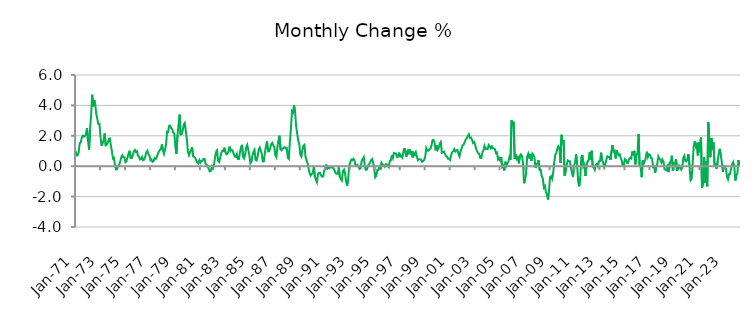
| Category | Series 0 |
|---|---|
| 1971-01-01 | 1.014 |
| 1971-02-01 | 0.711 |
| 1971-03-01 | 0.712 |
| 1971-04-01 | 0.919 |
| 1971-05-01 | 1.51 |
| 1971-06-01 | 1.551 |
| 1971-07-01 | 1.878 |
| 1971-08-01 | 2.005 |
| 1971-09-01 | 1.95 |
| 1971-10-01 | 1.987 |
| 1971-11-01 | 2.104 |
| 1971-12-01 | 2.509 |
| 1972-01-01 | 1.699 |
| 1972-02-01 | 1.094 |
| 1972-03-01 | 2.462 |
| 1972-04-01 | 3.36 |
| 1972-05-01 | 4.697 |
| 1972-06-01 | 3.937 |
| 1972-07-01 | 4.355 |
| 1972-08-01 | 4.026 |
| 1972-09-01 | 3.417 |
| 1972-10-01 | 3.088 |
| 1972-11-01 | 2.774 |
| 1972-12-01 | 2.784 |
| 1973-01-01 | 1.938 |
| 1973-02-01 | 1.343 |
| 1973-03-01 | 1.524 |
| 1973-04-01 | 1.712 |
| 1973-05-01 | 2.158 |
| 1973-06-01 | 1.373 |
| 1973-07-01 | 1.418 |
| 1973-08-01 | 1.551 |
| 1973-09-01 | 1.782 |
| 1973-10-01 | 1.816 |
| 1973-11-01 | 1.359 |
| 1973-12-01 | 0.961 |
| 1974-01-01 | 0.511 |
| 1974-02-01 | 0.548 |
| 1974-03-01 | -0.022 |
| 1974-04-01 | -0.216 |
| 1974-05-01 | -0.191 |
| 1974-06-01 | 0.007 |
| 1974-07-01 | 0.097 |
| 1974-08-01 | 0.326 |
| 1974-09-01 | 0.591 |
| 1974-10-01 | 0.722 |
| 1974-11-01 | 0.594 |
| 1974-12-01 | 0.583 |
| 1975-01-01 | 0.268 |
| 1975-02-01 | 0.337 |
| 1975-03-01 | 0.597 |
| 1975-04-01 | 0.845 |
| 1975-05-01 | 1.017 |
| 1975-06-01 | 0.539 |
| 1975-07-01 | 0.526 |
| 1975-08-01 | 0.722 |
| 1975-09-01 | 0.97 |
| 1975-10-01 | 1.067 |
| 1975-11-01 | 0.93 |
| 1975-12-01 | 0.985 |
| 1976-01-01 | 0.687 |
| 1976-02-01 | 0.643 |
| 1976-03-01 | 0.437 |
| 1976-04-01 | 0.463 |
| 1976-05-01 | 0.603 |
| 1976-06-01 | 0.392 |
| 1976-07-01 | 0.432 |
| 1976-08-01 | 0.636 |
| 1976-09-01 | 0.905 |
| 1976-10-01 | 1.011 |
| 1976-11-01 | 0.8 |
| 1976-12-01 | 0.709 |
| 1977-01-01 | 0.392 |
| 1977-02-01 | 0.448 |
| 1977-03-01 | 0.289 |
| 1977-04-01 | 0.338 |
| 1977-05-01 | 0.521 |
| 1977-06-01 | 0.47 |
| 1977-07-01 | 0.575 |
| 1977-08-01 | 0.784 |
| 1977-09-01 | 0.951 |
| 1977-10-01 | 1.061 |
| 1977-11-01 | 1.111 |
| 1977-12-01 | 1.434 |
| 1978-01-01 | 1.05 |
| 1978-02-01 | 0.811 |
| 1978-03-01 | 1.084 |
| 1978-04-01 | 1.443 |
| 1978-05-01 | 2.28 |
| 1978-06-01 | 2.255 |
| 1978-07-01 | 2.668 |
| 1978-08-01 | 2.665 |
| 1978-09-01 | 2.498 |
| 1978-10-01 | 2.424 |
| 1978-11-01 | 2.207 |
| 1978-12-01 | 2.133 |
| 1979-01-01 | 1.242 |
| 1979-02-01 | 0.823 |
| 1979-03-01 | 2.034 |
| 1979-04-01 | 2.732 |
| 1979-05-01 | 3.394 |
| 1979-06-01 | 2.083 |
| 1979-07-01 | 2.118 |
| 1979-08-01 | 2.335 |
| 1979-09-01 | 2.734 |
| 1979-10-01 | 2.841 |
| 1979-11-01 | 2.3 |
| 1979-12-01 | 1.747 |
| 1980-01-01 | 0.943 |
| 1980-02-01 | 0.726 |
| 1980-03-01 | 0.925 |
| 1980-04-01 | 1.073 |
| 1980-05-01 | 1.242 |
| 1980-06-01 | 0.656 |
| 1980-07-01 | 0.591 |
| 1980-08-01 | 0.543 |
| 1980-09-01 | 0.381 |
| 1980-10-01 | 0.243 |
| 1980-11-01 | 0.186 |
| 1980-12-01 | 0.395 |
| 1981-01-01 | 0.234 |
| 1981-02-01 | 0.354 |
| 1981-03-01 | 0.354 |
| 1981-04-01 | 0.474 |
| 1981-05-01 | 0.478 |
| 1981-06-01 | 0.161 |
| 1981-07-01 | 0.077 |
| 1981-08-01 | 0.019 |
| 1981-09-01 | -0.188 |
| 1981-10-01 | -0.344 |
| 1981-11-01 | -0.317 |
| 1981-12-01 | -0.035 |
| 1982-01-01 | -0.155 |
| 1982-02-01 | 0.068 |
| 1982-03-01 | 0.555 |
| 1982-04-01 | 0.929 |
| 1982-05-01 | 1.031 |
| 1982-06-01 | 0.372 |
| 1982-07-01 | 0.28 |
| 1982-08-01 | 0.532 |
| 1982-09-01 | 0.859 |
| 1982-10-01 | 1.012 |
| 1982-11-01 | 0.998 |
| 1982-12-01 | 1.225 |
| 1983-01-01 | 0.92 |
| 1983-02-01 | 0.783 |
| 1983-03-01 | 0.81 |
| 1983-04-01 | 0.995 |
| 1983-05-01 | 1.293 |
| 1983-06-01 | 1.001 |
| 1983-07-01 | 1.08 |
| 1983-08-01 | 1.015 |
| 1983-09-01 | 0.803 |
| 1983-10-01 | 0.652 |
| 1983-11-01 | 0.611 |
| 1983-12-01 | 0.798 |
| 1984-01-01 | 0.473 |
| 1984-02-01 | 0.478 |
| 1984-03-01 | 0.903 |
| 1984-04-01 | 1.241 |
| 1984-05-01 | 1.404 |
| 1984-06-01 | 0.614 |
| 1984-07-01 | 0.511 |
| 1984-08-01 | 0.774 |
| 1984-09-01 | 1.225 |
| 1984-10-01 | 1.401 |
| 1984-11-01 | 1.068 |
| 1984-12-01 | 0.734 |
| 1985-01-01 | 0.202 |
| 1985-02-01 | 0.279 |
| 1985-03-01 | 0.684 |
| 1985-04-01 | 0.954 |
| 1985-05-01 | 1.079 |
| 1985-06-01 | 0.413 |
| 1985-07-01 | 0.38 |
| 1985-08-01 | 0.656 |
| 1985-09-01 | 1.087 |
| 1985-10-01 | 1.228 |
| 1985-11-01 | 1.02 |
| 1985-12-01 | 0.807 |
| 1986-01-01 | 0.311 |
| 1986-02-01 | 0.317 |
| 1986-03-01 | 0.923 |
| 1986-04-01 | 1.322 |
| 1986-05-01 | 1.629 |
| 1986-06-01 | 0.97 |
| 1986-07-01 | 0.982 |
| 1986-08-01 | 1.161 |
| 1986-09-01 | 1.443 |
| 1986-10-01 | 1.536 |
| 1986-11-01 | 1.373 |
| 1986-12-01 | 1.263 |
| 1987-01-01 | 0.724 |
| 1987-02-01 | 0.595 |
| 1987-03-01 | 1.283 |
| 1987-04-01 | 1.705 |
| 1987-05-01 | 2.003 |
| 1987-06-01 | 1.108 |
| 1987-07-01 | 1.049 |
| 1987-08-01 | 1.142 |
| 1987-09-01 | 1.226 |
| 1987-10-01 | 1.253 |
| 1987-11-01 | 1.16 |
| 1987-12-01 | 1.188 |
| 1988-01-01 | 0.558 |
| 1988-02-01 | 0.478 |
| 1988-03-01 | 1.666 |
| 1988-04-01 | 2.466 |
| 1988-05-01 | 3.62 |
| 1988-06-01 | 3.526 |
| 1988-07-01 | 4.01 |
| 1988-08-01 | 3.546 |
| 1988-09-01 | 2.637 |
| 1988-10-01 | 2.133 |
| 1988-11-01 | 1.68 |
| 1988-12-01 | 1.467 |
| 1989-01-01 | 0.756 |
| 1989-02-01 | 0.634 |
| 1989-03-01 | 1.069 |
| 1989-04-01 | 1.347 |
| 1989-05-01 | 1.408 |
| 1989-06-01 | 0.607 |
| 1989-07-01 | 0.411 |
| 1989-08-01 | 0.192 |
| 1989-09-01 | -0.165 |
| 1989-10-01 | -0.462 |
| 1989-11-01 | -0.618 |
| 1989-12-01 | -0.507 |
| 1990-01-01 | -0.459 |
| 1990-02-01 | -0.019 |
| 1990-03-01 | -0.686 |
| 1990-04-01 | -0.897 |
| 1990-05-01 | -1.058 |
| 1990-06-01 | -0.51 |
| 1990-07-01 | -0.437 |
| 1990-08-01 | -0.428 |
| 1990-09-01 | -0.604 |
| 1990-10-01 | -0.695 |
| 1990-11-01 | -0.649 |
| 1990-12-01 | -0.278 |
| 1991-01-01 | -0.196 |
| 1991-02-01 | 0.105 |
| 1991-03-01 | -0.159 |
| 1991-04-01 | -0.105 |
| 1991-05-01 | -0.139 |
| 1991-06-01 | -0.062 |
| 1991-07-01 | -0.066 |
| 1991-08-01 | -0.093 |
| 1991-09-01 | -0.159 |
| 1991-10-01 | -0.285 |
| 1991-11-01 | -0.467 |
| 1991-12-01 | -0.497 |
| 1992-01-01 | -0.494 |
| 1992-02-01 | -0.076 |
| 1992-03-01 | -0.697 |
| 1992-04-01 | -0.848 |
| 1992-05-01 | -0.944 |
| 1992-06-01 | -0.312 |
| 1992-07-01 | -0.225 |
| 1992-08-01 | -0.473 |
| 1992-09-01 | -1.015 |
| 1992-10-01 | -1.272 |
| 1992-11-01 | -0.873 |
| 1992-12-01 | 0.026 |
| 1993-01-01 | 0.247 |
| 1993-02-01 | 0.437 |
| 1993-03-01 | 0.391 |
| 1993-04-01 | 0.487 |
| 1993-05-01 | 0.413 |
| 1993-06-01 | 0.047 |
| 1993-07-01 | 0.03 |
| 1993-08-01 | 0.082 |
| 1993-09-01 | -0.063 |
| 1993-10-01 | -0.18 |
| 1993-11-01 | -0.118 |
| 1993-12-01 | 0.35 |
| 1994-01-01 | 0.48 |
| 1994-02-01 | 0.595 |
| 1994-03-01 | -0.023 |
| 1994-04-01 | -0.241 |
| 1994-05-01 | -0.212 |
| 1994-06-01 | 0.019 |
| 1994-07-01 | 0.12 |
| 1994-08-01 | 0.247 |
| 1994-09-01 | 0.391 |
| 1994-10-01 | 0.472 |
| 1994-11-01 | 0.222 |
| 1994-12-01 | -0.131 |
| 1995-01-01 | -0.733 |
| 1995-02-01 | -0.635 |
| 1995-03-01 | -0.24 |
| 1995-04-01 | -0.251 |
| 1995-05-01 | 0.043 |
| 1995-06-01 | -0.212 |
| 1995-07-01 | 0.218 |
| 1995-08-01 | 0.097 |
| 1995-09-01 | 0.057 |
| 1995-10-01 | -0.036 |
| 1995-11-01 | 0.126 |
| 1995-12-01 | 0.123 |
| 1996-01-01 | 0.036 |
| 1996-02-01 | -0.061 |
| 1996-03-01 | 0.33 |
| 1996-04-01 | 0.389 |
| 1996-05-01 | 0.736 |
| 1996-06-01 | 0.535 |
| 1996-07-01 | 0.868 |
| 1996-08-01 | 0.833 |
| 1996-09-01 | 0.834 |
| 1996-10-01 | 0.603 |
| 1996-11-01 | 0.635 |
| 1996-12-01 | 0.892 |
| 1997-01-01 | 0.634 |
| 1997-02-01 | 0.672 |
| 1997-03-01 | 0.57 |
| 1997-04-01 | 0.919 |
| 1997-05-01 | 1.19 |
| 1997-06-01 | 0.893 |
| 1997-07-01 | 0.625 |
| 1997-08-01 | 0.99 |
| 1997-09-01 | 0.877 |
| 1997-10-01 | 1.126 |
| 1997-11-01 | 0.779 |
| 1997-12-01 | 0.981 |
| 1998-01-01 | 0.576 |
| 1998-02-01 | 0.861 |
| 1998-03-01 | 0.744 |
| 1998-04-01 | 0.917 |
| 1998-05-01 | 0.646 |
| 1998-06-01 | 0.394 |
| 1998-07-01 | 0.47 |
| 1998-08-01 | 0.438 |
| 1998-09-01 | 0.441 |
| 1998-10-01 | 0.291 |
| 1998-11-01 | 0.339 |
| 1998-12-01 | 0.406 |
| 1999-01-01 | 0.599 |
| 1999-02-01 | 1.189 |
| 1999-03-01 | 1.036 |
| 1999-04-01 | 1.017 |
| 1999-05-01 | 1.102 |
| 1999-06-01 | 1.154 |
| 1999-07-01 | 1.343 |
| 1999-08-01 | 1.715 |
| 1999-09-01 | 1.719 |
| 1999-10-01 | 1.552 |
| 1999-11-01 | 1.038 |
| 1999-12-01 | 1.38 |
| 2000-01-01 | 1.085 |
| 2000-02-01 | 1.214 |
| 2000-03-01 | 1.492 |
| 2000-04-01 | 1.598 |
| 2000-05-01 | 0.89 |
| 2000-06-01 | 0.921 |
| 2000-07-01 | 0.966 |
| 2000-08-01 | 0.796 |
| 2000-09-01 | 0.675 |
| 2000-10-01 | 0.638 |
| 2000-11-01 | 0.487 |
| 2000-12-01 | 0.497 |
| 2001-01-01 | 0.412 |
| 2001-02-01 | 0.769 |
| 2001-03-01 | 0.912 |
| 2001-04-01 | 0.993 |
| 2001-05-01 | 1.124 |
| 2001-06-01 | 0.967 |
| 2001-07-01 | 1.046 |
| 2001-08-01 | 1.074 |
| 2001-09-01 | 0.81 |
| 2001-10-01 | 0.64 |
| 2001-11-01 | 0.977 |
| 2001-12-01 | 1.162 |
| 2002-01-01 | 1.393 |
| 2002-02-01 | 1.426 |
| 2002-03-01 | 1.606 |
| 2002-04-01 | 1.755 |
| 2002-05-01 | 1.852 |
| 2002-06-01 | 1.986 |
| 2002-07-01 | 2.098 |
| 2002-08-01 | 1.873 |
| 2002-09-01 | 1.884 |
| 2002-10-01 | 1.739 |
| 2002-11-01 | 1.527 |
| 2002-12-01 | 1.595 |
| 2003-01-01 | 1.421 |
| 2003-02-01 | 1.131 |
| 2003-03-01 | 0.968 |
| 2003-04-01 | 0.845 |
| 2003-05-01 | 0.804 |
| 2003-06-01 | 0.543 |
| 2003-07-01 | 0.544 |
| 2003-08-01 | 0.903 |
| 2003-09-01 | 1.045 |
| 2003-10-01 | 1.331 |
| 2003-11-01 | 1.129 |
| 2003-12-01 | 1.158 |
| 2004-01-01 | 1.129 |
| 2004-02-01 | 1.4 |
| 2004-03-01 | 1.322 |
| 2004-04-01 | 1.181 |
| 2004-05-01 | 1.302 |
| 2004-06-01 | 1.177 |
| 2004-07-01 | 1.173 |
| 2004-08-01 | 1.116 |
| 2004-09-01 | 0.859 |
| 2004-10-01 | 0.903 |
| 2004-11-01 | 0.446 |
| 2004-12-01 | 0.537 |
| 2005-01-01 | 0.389 |
| 2005-02-01 | 0.608 |
| 2005-03-01 | -0.051 |
| 2005-04-01 | 0.02 |
| 2005-05-01 | -0.284 |
| 2005-06-01 | 0.293 |
| 2005-07-01 | 0.028 |
| 2005-08-01 | 0.174 |
| 2005-09-01 | 0.31 |
| 2005-10-01 | 0.6 |
| 2005-11-01 | 0.429 |
| 2005-12-01 | 3.014 |
| 2006-01-01 | 2.685 |
| 2006-02-01 | 2.921 |
| 2006-03-01 | 0.474 |
| 2006-04-01 | 0.778 |
| 2006-05-01 | 0.48 |
| 2006-06-01 | 0.585 |
| 2006-07-01 | 0.184 |
| 2006-08-01 | 0.682 |
| 2006-09-01 | 0.777 |
| 2006-10-01 | 0.666 |
| 2006-11-01 | 0.183 |
| 2006-12-01 | -1.12 |
| 2007-01-01 | -0.865 |
| 2007-02-01 | -0.455 |
| 2007-03-01 | 0.64 |
| 2007-04-01 | 0.822 |
| 2007-05-01 | 0.511 |
| 2007-06-01 | 0.806 |
| 2007-07-01 | 0.354 |
| 2007-08-01 | 0.823 |
| 2007-09-01 | 0.74 |
| 2007-10-01 | 0.585 |
| 2007-11-01 | -0.117 |
| 2007-12-01 | 0.11 |
| 2008-01-01 | 0.185 |
| 2008-02-01 | 0.395 |
| 2008-03-01 | -0.258 |
| 2008-04-01 | -0.252 |
| 2008-05-01 | -0.673 |
| 2008-06-01 | -0.785 |
| 2008-07-01 | -1.399 |
| 2008-08-01 | -1.297 |
| 2008-09-01 | -1.695 |
| 2008-10-01 | -1.889 |
| 2008-11-01 | -2.193 |
| 2008-12-01 | -1.569 |
| 2009-01-01 | -0.715 |
| 2009-02-01 | -0.655 |
| 2009-03-01 | -0.832 |
| 2009-04-01 | -0.431 |
| 2009-05-01 | 0.255 |
| 2009-06-01 | 0.758 |
| 2009-07-01 | 0.853 |
| 2009-08-01 | 1.154 |
| 2009-09-01 | 1.31 |
| 2009-10-01 | 1.192 |
| 2009-11-01 | 0.21 |
| 2009-12-01 | 2.065 |
| 2010-01-01 | 1.513 |
| 2010-02-01 | 1.706 |
| 2010-03-01 | -0.629 |
| 2010-04-01 | -0.336 |
| 2010-05-01 | 0.088 |
| 2010-06-01 | 0.377 |
| 2010-07-01 | 0.335 |
| 2010-08-01 | 0.331 |
| 2010-09-01 | -0.082 |
| 2010-10-01 | -0.397 |
| 2010-11-01 | -0.716 |
| 2010-12-01 | 0.063 |
| 2011-01-01 | 0.22 |
| 2011-02-01 | 0.778 |
| 2011-03-01 | 0.121 |
| 2011-04-01 | -1.012 |
| 2011-05-01 | -1.326 |
| 2011-06-01 | -0.771 |
| 2011-07-01 | 0.572 |
| 2011-08-01 | 0.742 |
| 2011-09-01 | -0.009 |
| 2011-10-01 | 0.122 |
| 2011-11-01 | -0.644 |
| 2011-12-01 | 0.033 |
| 2012-01-01 | 0.301 |
| 2012-02-01 | 0.375 |
| 2012-03-01 | 0.909 |
| 2012-04-01 | 0.411 |
| 2012-05-01 | 1.018 |
| 2012-06-01 | -0.034 |
| 2012-07-01 | -0.071 |
| 2012-08-01 | -0.232 |
| 2012-09-01 | 0.088 |
| 2012-10-01 | 0.148 |
| 2012-11-01 | -0.013 |
| 2012-12-01 | 0.323 |
| 2013-01-01 | 0.342 |
| 2013-02-01 | 0.887 |
| 2013-03-01 | 0.401 |
| 2013-04-01 | 0.253 |
| 2013-05-01 | -0.07 |
| 2013-06-01 | 0.125 |
| 2013-07-01 | 0.425 |
| 2013-08-01 | 0.649 |
| 2013-09-01 | 0.612 |
| 2013-10-01 | 0.611 |
| 2013-11-01 | 0.411 |
| 2013-12-01 | 0.973 |
| 2014-01-01 | 1.387 |
| 2014-02-01 | 0.96 |
| 2014-03-01 | 1.009 |
| 2014-04-01 | 0.509 |
| 2014-05-01 | 1.049 |
| 2014-06-01 | 0.832 |
| 2014-07-01 | 0.722 |
| 2014-08-01 | 0.774 |
| 2014-09-01 | 0.517 |
| 2014-10-01 | 0.349 |
| 2014-11-01 | -0.043 |
| 2014-12-01 | 0.166 |
| 2015-01-01 | 0.474 |
| 2015-02-01 | 0.409 |
| 2015-03-01 | 0.22 |
| 2015-04-01 | 0.227 |
| 2015-05-01 | 0.48 |
| 2015-06-01 | 0.546 |
| 2015-07-01 | 0.503 |
| 2015-08-01 | 0.962 |
| 2015-09-01 | 0.722 |
| 2015-10-01 | 1.009 |
| 2015-11-01 | 0.122 |
| 2015-12-01 | 0.777 |
| 2016-01-01 | 0.8 |
| 2016-02-01 | 2.119 |
| 2016-03-01 | 0.079 |
| 2016-04-01 | -0.073 |
| 2016-05-01 | -0.725 |
| 2016-06-01 | 0.377 |
| 2016-07-01 | 0.18 |
| 2016-08-01 | 0.326 |
| 2016-09-01 | 0.568 |
| 2016-10-01 | 0.952 |
| 2016-11-01 | 0.607 |
| 2016-12-01 | 0.782 |
| 2017-01-01 | 0.741 |
| 2017-02-01 | 0.545 |
| 2017-03-01 | 0.511 |
| 2017-04-01 | -0.073 |
| 2017-05-01 | -0.051 |
| 2017-06-01 | -0.425 |
| 2017-07-01 | -0.025 |
| 2017-08-01 | 0.142 |
| 2017-09-01 | 0.642 |
| 2017-10-01 | 0.491 |
| 2017-11-01 | 0.429 |
| 2017-12-01 | 0.248 |
| 2018-01-01 | 0.435 |
| 2018-02-01 | 0.294 |
| 2018-03-01 | -0.206 |
| 2018-04-01 | -0.223 |
| 2018-05-01 | -0.269 |
| 2018-06-01 | 0.109 |
| 2018-07-01 | -0.387 |
| 2018-08-01 | 0.249 |
| 2018-09-01 | 0.274 |
| 2018-10-01 | 0.688 |
| 2018-11-01 | -0.297 |
| 2018-12-01 | 0.192 |
| 2019-01-01 | 0.153 |
| 2019-02-01 | 0.466 |
| 2019-03-01 | -0.248 |
| 2019-04-01 | -0.226 |
| 2019-05-01 | 0.03 |
| 2019-06-01 | -0.078 |
| 2019-07-01 | -0.218 |
| 2019-08-01 | -0.086 |
| 2019-09-01 | 0.545 |
| 2019-10-01 | 0.682 |
| 2019-11-01 | 0.347 |
| 2019-12-01 | 0.32 |
| 2020-01-01 | 0.474 |
| 2020-02-01 | 0.786 |
| 2020-03-01 | 0.013 |
| 2020-04-01 | -0.927 |
| 2020-05-01 | -0.83 |
| 2020-06-01 | 0.174 |
| 2020-07-01 | 1.337 |
| 2020-08-01 | 1.64 |
| 2020-09-01 | 1.328 |
| 2020-10-01 | 1.541 |
| 2020-11-01 | 0.713 |
| 2020-12-01 | 1.587 |
| 2021-01-01 | 0.914 |
| 2021-02-01 | 1.883 |
| 2021-03-01 | -1.407 |
| 2021-04-01 | -1.184 |
| 2021-05-01 | 0.594 |
| 2021-06-01 | -1.104 |
| 2021-07-01 | 0.328 |
| 2021-08-01 | -1.328 |
| 2021-09-01 | 2.887 |
| 2021-10-01 | 1.799 |
| 2021-11-01 | 0.591 |
| 2021-12-01 | 1.861 |
| 2022-01-01 | 1.114 |
| 2022-02-01 | 1.566 |
| 2022-03-01 | 0.061 |
| 2022-04-01 | 0.097 |
| 2022-05-01 | -0.169 |
| 2022-06-01 | 0.322 |
| 2022-07-01 | 0.793 |
| 2022-08-01 | 1.143 |
| 2022-09-01 | 0.749 |
| 2022-10-01 | 0.281 |
| 2022-11-01 | -0.383 |
| 2022-12-01 | -0.017 |
| 2023-01-01 | -0.072 |
| 2023-02-01 | -0.146 |
| 2023-03-01 | -0.708 |
| 2023-04-01 | -0.87 |
| 2023-05-01 | -0.517 |
| 2023-06-01 | -0.505 |
| 2023-07-01 | -0.144 |
| 2023-08-01 | 0.133 |
| 2023-09-01 | 0.278 |
| 2023-10-01 | 0.001 |
| 2023-11-01 | -0.944 |
| 2023-12-01 | -0.613 |
| 2024-01-01 | -0.455 |
| 2024-02-01 | 0.403 |
| 2024-03-01 | 0.06 |